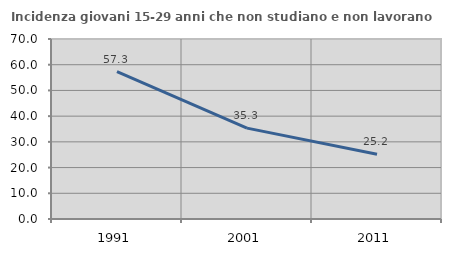
| Category | Incidenza giovani 15-29 anni che non studiano e non lavorano  |
|---|---|
| 1991.0 | 57.289 |
| 2001.0 | 35.331 |
| 2011.0 | 25.185 |